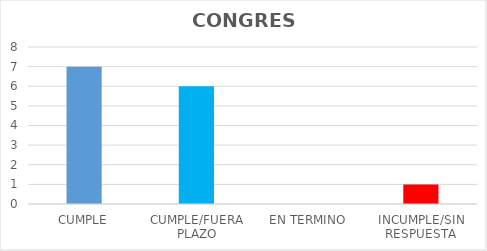
| Category | TOTAL |
|---|---|
| CUMPLE | 7 |
| CUMPLE/FUERA PLAZO | 6 |
| EN TERMINO | 0 |
| INCUMPLE/SIN RESPUESTA | 1 |